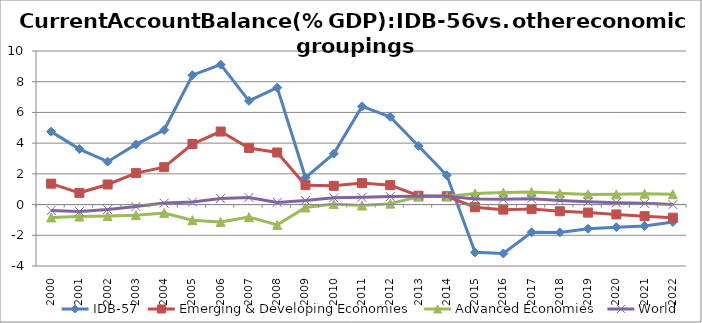
| Category | IDB-57 | Emerging & Developing Economies | Advanced Economies | World |
|---|---|---|---|---|
| 2000.0 | 4.75 | 1.362 | -0.838 | -0.381 |
| 2001.0 | 3.614 | 0.766 | -0.778 | -0.452 |
| 2002.0 | 2.793 | 1.309 | -0.742 | -0.325 |
| 2003.0 | 3.917 | 2.05 | -0.691 | -0.133 |
| 2004.0 | 4.852 | 2.433 | -0.546 | 0.095 |
| 2005.0 | 8.425 | 3.944 | -1.017 | 0.161 |
| 2006.0 | 9.111 | 4.756 | -1.128 | 0.401 |
| 2007.0 | 6.753 | 3.687 | -0.818 | 0.461 |
| 2008.0 | 7.613 | 3.39 | -1.323 | 0.143 |
| 2009.0 | 1.76 | 1.264 | -0.19 | 0.266 |
| 2010.0 | 3.315 | 1.222 | 0.032 | 0.442 |
| 2011.0 | 6.394 | 1.398 | -0.063 | 0.472 |
| 2012.0 | 5.708 | 1.263 | 0.061 | 0.518 |
| 2013.0 | 3.819 | 0.576 | 0.514 | 0.538 |
| 2014.0 | 1.912 | 0.543 | 0.531 | 0.535 |
| 2015.0 | -3.112 | -0.174 | 0.724 | 0.369 |
| 2016.0 | -3.186 | -0.33 | 0.784 | 0.351 |
| 2017.0 | -1.801 | -0.294 | 0.816 | 0.377 |
| 2018.0 | -1.812 | -0.435 | 0.73 | 0.262 |
| 2019.0 | -1.574 | -0.523 | 0.662 | 0.176 |
| 2020.0 | -1.469 | -0.643 | 0.666 | 0.117 |
| 2021.0 | -1.395 | -0.754 | 0.708 | 0.08 |
| 2022.0 | -1.134 | -0.855 | 0.672 | 0.001 |